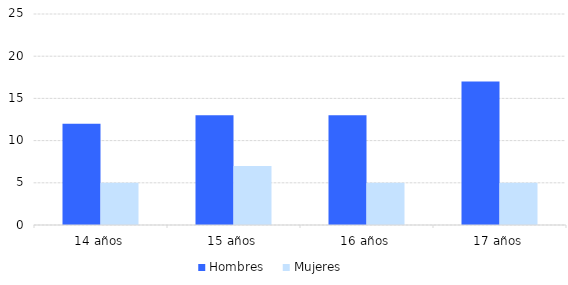
| Category | Hombres | Mujeres |
|---|---|---|
| 14 años | 12 | 5 |
| 15 años | 13 | 7 |
| 16 años | 13 | 5 |
| 17 años | 17 | 5 |